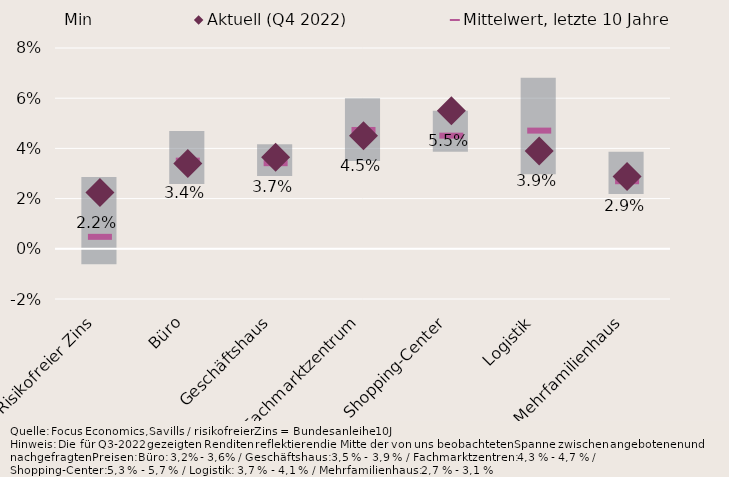
| Category | Min | Spanne Min/Max, letzte 10 Jahre |
|---|---|---|
| Risikofreier Zins | -0.006 | 0.029 |
| Büro | 0.026 | 0.021 |
| Geschäftshaus | 0.029 | 0.013 |
| Fachmarktzentrum | 0.035 | 0.025 |
| Shopping-Center | 0.039 | 0.016 |
| Logistik | 0.03 | 0.038 |
| Mehrfamilienhaus | 0.022 | 0.017 |